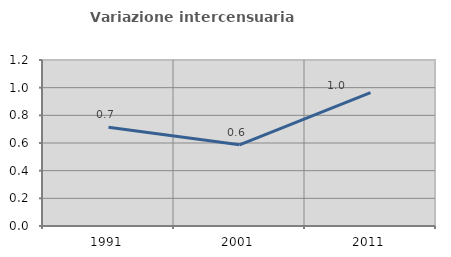
| Category | Variazione intercensuaria annua |
|---|---|
| 1991.0 | 0.713 |
| 2001.0 | 0.587 |
| 2011.0 | 0.964 |